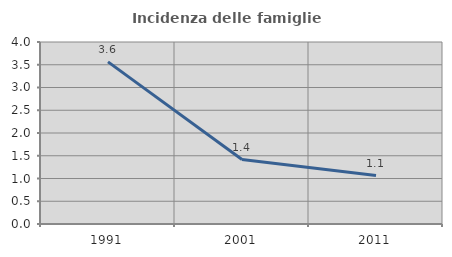
| Category | Incidenza delle famiglie numerose |
|---|---|
| 1991.0 | 3.562 |
| 2001.0 | 1.417 |
| 2011.0 | 1.064 |